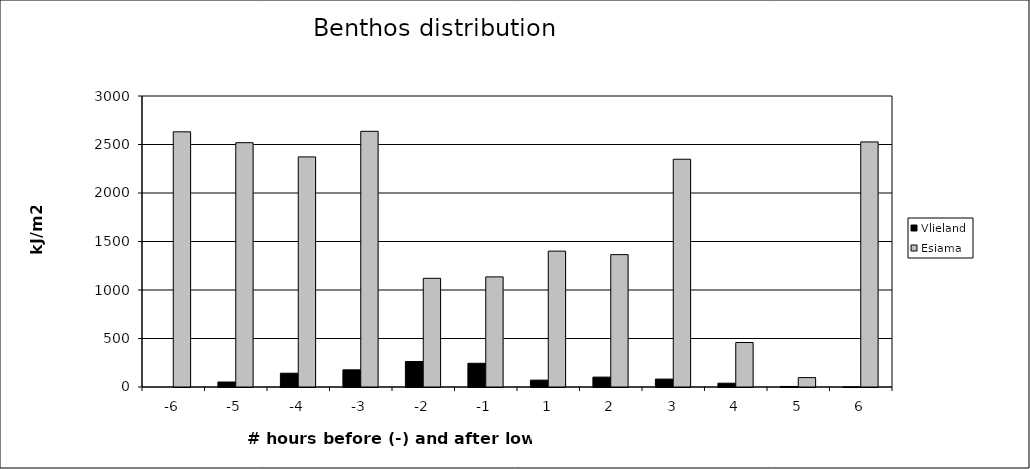
| Category | Vlieland | Esiama |
|---|---|---|
| -6.0 | 0 | 2630.645 |
| -5.0 | 51.54 | 2518.554 |
| -4.0 | 142.009 | 2372.139 |
| -3.0 | 176.96 | 2635.895 |
| -2.0 | 262.613 | 1120.605 |
| -1.0 | 244.368 | 1135.152 |
| 1.0 | 70.853 | 1400.68 |
| 2.0 | 101.958 | 1364.587 |
| 3.0 | 81.517 | 2347.959 |
| 4.0 | 39.132 | 458.636 |
| 5.0 | 5.524 | 96.905 |
| 6.0 | 0.427 | 2526.402 |